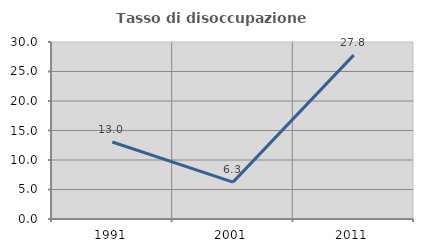
| Category | Tasso di disoccupazione giovanile  |
|---|---|
| 1991.0 | 13.043 |
| 2001.0 | 6.25 |
| 2011.0 | 27.778 |